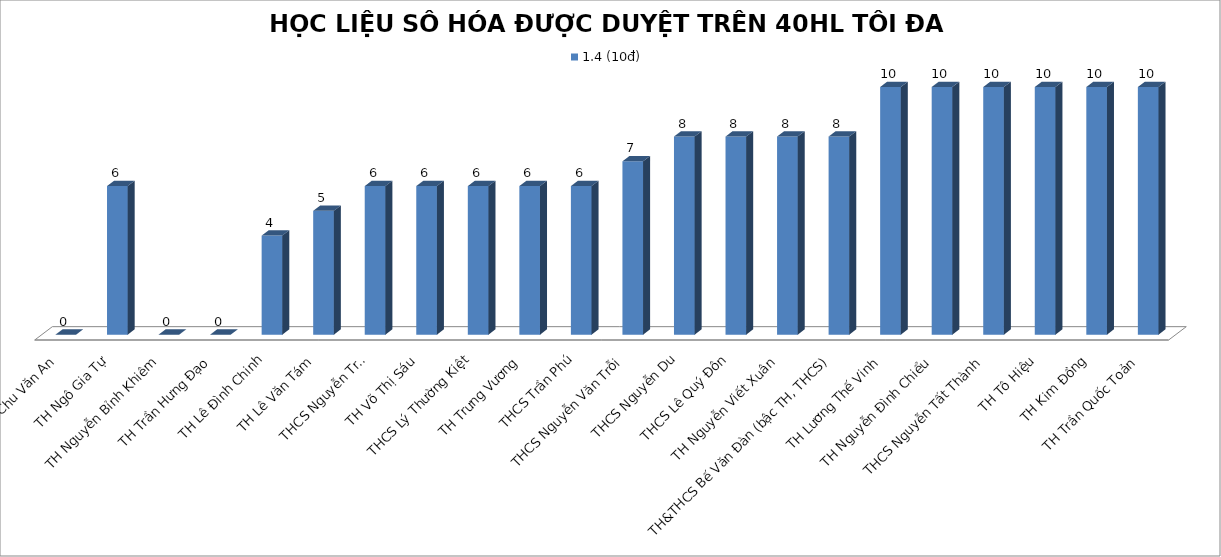
| Category | 1.4 (10đ) |
|---|---|
| TH Chu Văn An | 0 |
| TH Ngô Gia Tự | 6 |
| TH Nguyễn Bỉnh Khiêm | 0 |
| TH Trần Hưng Đạo | 0 |
| TH Lê Đình Chinh | 4 |
| TH Lê Văn Tám | 5 |
| THCS Nguyễn Trãi | 6 |
| TH Võ Thị Sáu | 6 |
| THCS Lý Thường Kiệt | 6 |
| TH Trưng Vương | 6 |
| THCS Trần Phú | 6 |
| THCS Nguyễn Văn Trỗi | 7 |
| THCS Nguyễn Du | 8 |
| THCS Lê Quý Đôn | 8 |
| TH Nguyễn Viết Xuân | 8 |
| TH&THCS Bế Văn Đàn (bậc TH, THCS) | 8 |
| TH Lương Thế Vinh | 10 |
| TH Nguyễn Đình Chiểu | 10 |
| THCS Nguyễn Tất Thành | 10 |
| TH Tô Hiệu | 10 |
| TH Kim Đồng | 10 |
| TH Trần Quốc Toản | 10 |